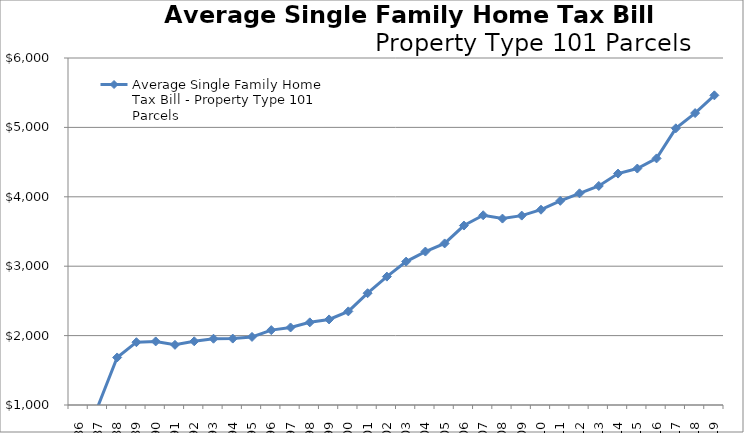
| Category | Average Single Family Home Tax Bill - Property Type 101 Parcels |
|---|---|
| 1986.0 | 947.494 |
| 1987.0 | 979.531 |
| 1988.0 | 1685 |
| 1989.0 | 1905 |
| 1990.0 | 1916 |
| 1991.0 | 1867 |
| 1992.0 | 1918 |
| 1993.0 | 1955 |
| 1994.0 | 1957 |
| 1995.0 | 1981 |
| 1996.0 | 2079 |
| 1997.0 | 2117 |
| 1998.0 | 2191 |
| 1999.0 | 2233 |
| 2000.0 | 2349 |
| 2001.0 | 2611 |
| 2002.0 | 2850 |
| 2003.0 | 3066 |
| 2004.0 | 3211 |
| 2005.0 | 3328 |
| 2006.0 | 3586 |
| 2007.0 | 3734 |
| 2008.0 | 3686 |
| 2009.0 | 3729 |
| 2010.0 | 3814 |
| 2011.0 | 3941.818 |
| 2012.0 | 4050.028 |
| 2013.0 | 4156 |
| 2014.0 | 4334.828 |
| 2015.0 | 4407 |
| 2016.0 | 4553.158 |
| 2017.0 | 4986.723 |
| 2018.0 | 5206 |
| 2019.0 | 5461.8 |